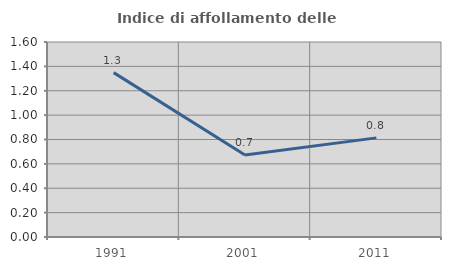
| Category | Indice di affollamento delle abitazioni  |
|---|---|
| 1991.0 | 1.349 |
| 2001.0 | 0.673 |
| 2011.0 | 0.813 |